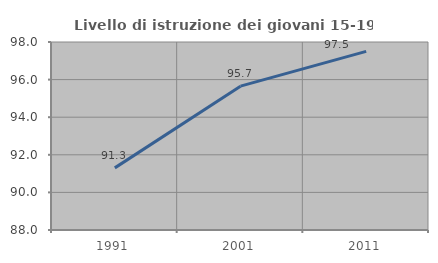
| Category | Livello di istruzione dei giovani 15-19 anni |
|---|---|
| 1991.0 | 91.304 |
| 2001.0 | 95.652 |
| 2011.0 | 97.5 |